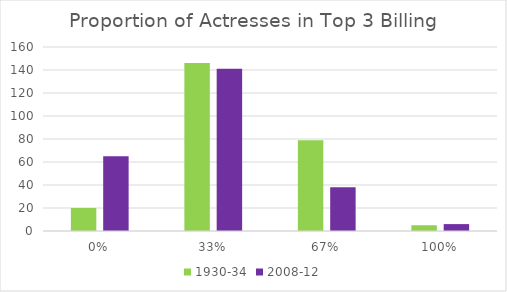
| Category | 1930-34 | 2008-12 |
|---|---|---|
| 0.0 | 20 | 65 |
| 0.33 | 146 | 141 |
| 0.67 | 79 | 38 |
| 1.0 | 5 | 6 |